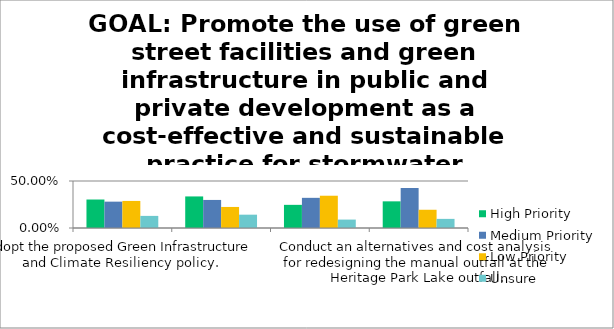
| Category | High Priority | Medium Priority | Low Priority | Unsure |
|---|---|---|---|---|
| Adopt the proposed Green Infrastructure and Climate Resiliency policy. | 0.303 | 0.28 | 0.288 | 0.129 |
| Take advantage of State programs such as the new One Stop for Growth (learn more here) to secure funding to implement the projects that result from adoption of the policy. | 0.336 | 0.298 | 0.224 | 0.142 |
| Conduct a parking inventory to identify under- and over-utilized spaces and options to reduce impervious cover through consolidation and/or integrate solar canopies over the necessary parking. | 0.246 | 0.321 | 0.343 | 0.09 |
| Conduct an alternatives and cost analysis for redesigning the manual outfall at the Heritage Park Lake outfall. | 0.284 | 0.425 | 0.194 | 0.097 |